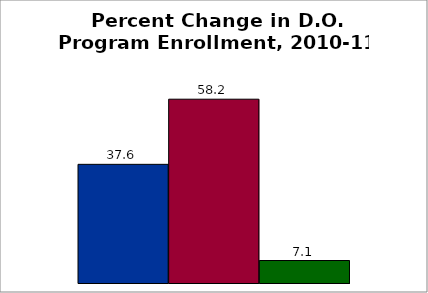
| Category | 50 states and D.C. | SREB states | State |
|---|---|---|---|
| 0 | 37.585 | 58.221 | 7.126 |